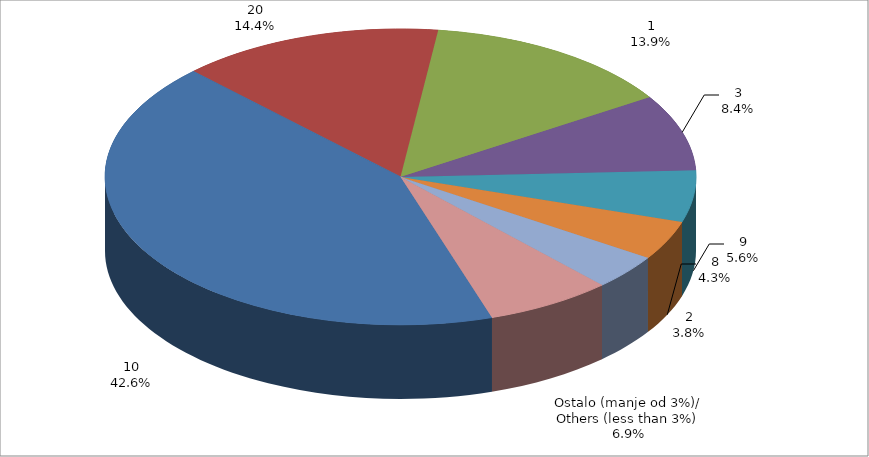
| Category | Series 0 |
|---|---|
| 10 | 10838533.639 |
| 20 | 3660152.366 |
| 1 | 3535452.83 |
| 3 | 2123740.918 |
| 9 | 1431415.258 |
| 8 | 1091471.352 |
| 2 | 975774.74 |
| Ostalo (manje od 3%)/
Others (less than 3%) | 1764022.249 |